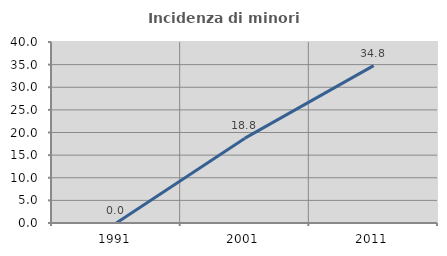
| Category | Incidenza di minori stranieri |
|---|---|
| 1991.0 | 0 |
| 2001.0 | 18.75 |
| 2011.0 | 34.783 |